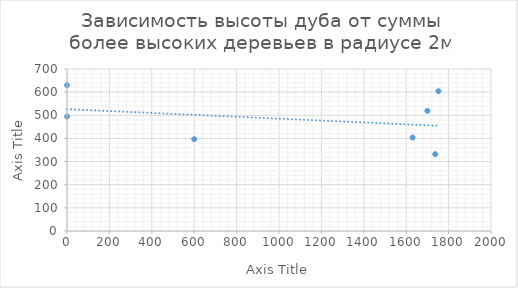
| Category | Series 0 |
|---|---|
| 1630.0 | 404 |
| 0.0 | 630 |
| 1737.0 | 332 |
| 1700.0 | 519 |
| 0.0 | 495 |
| 600.0 | 397 |
| 1752.0 | 604 |